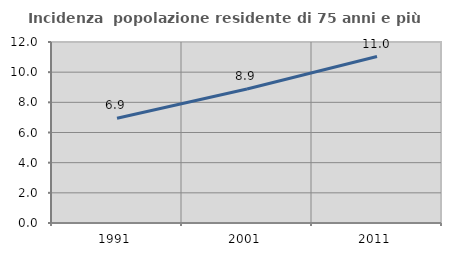
| Category | Incidenza  popolazione residente di 75 anni e più |
|---|---|
| 1991.0 | 6.943 |
| 2001.0 | 8.884 |
| 2011.0 | 11.034 |